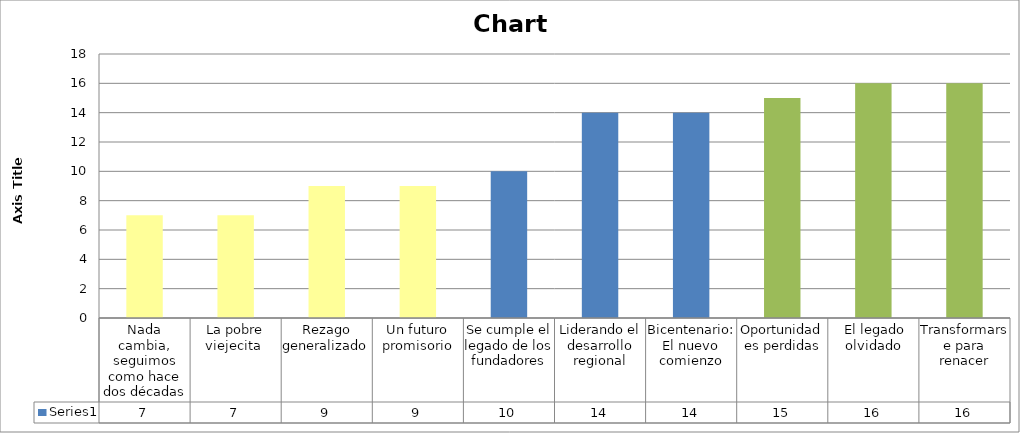
| Category | Series 0 |
|---|---|
| Nada cambia, seguimos como hace dos décadas | 7 |
| La pobre viejecita  | 7 |
| Rezago generalizado  | 9 |
| Un futuro promisorio | 9 |
| Se cumple el legado de los fundadores | 10 |
| Liderando el desarrollo regional | 14 |
| Bicentenario: El nuevo comienzo | 14 |
| Oportunidades perdidas | 15 |
|  El legado olvidado | 16 |
| Transformarse para renacer | 16 |